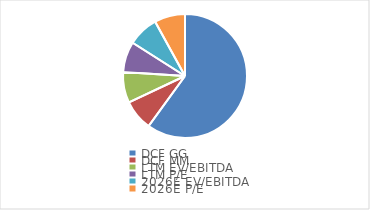
| Category | Series 0 |
|---|---|
| DCF GG | 0.6 |
| DCF MM | 0.08 |
| LTM EV/EBITDA | 0.08 |
| LTM P/E | 0.08 |
| 2026E EV/EBITDA | 0.08 |
| 2026E P/E | 0.08 |